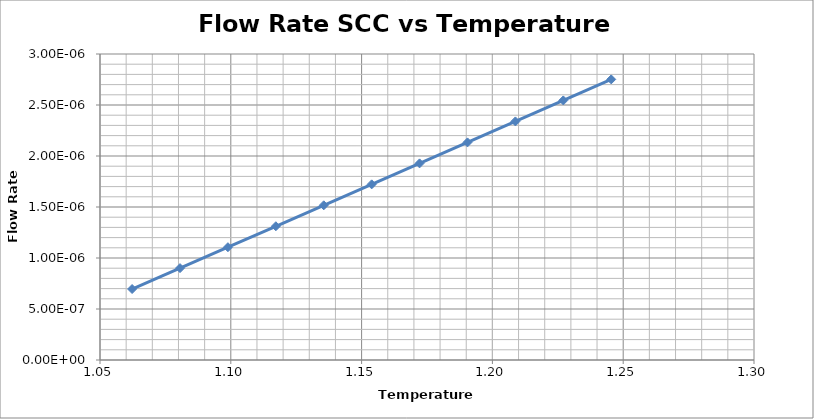
| Category | Series 0 |
|---|---|
| 1.0622710622710623 | 0 |
| 1.0805860805860805 | 0 |
| 1.098901098901099 | 0 |
| 1.1172161172161172 | 0 |
| 1.1355311355311355 | 0 |
| 1.1538461538461537 | 0 |
| 1.1721611721611722 | 0 |
| 1.1904761904761905 | 0 |
| 1.2087912087912087 | 0 |
| 1.2271062271062272 | 0 |
| 1.2454212454212454 | 0 |